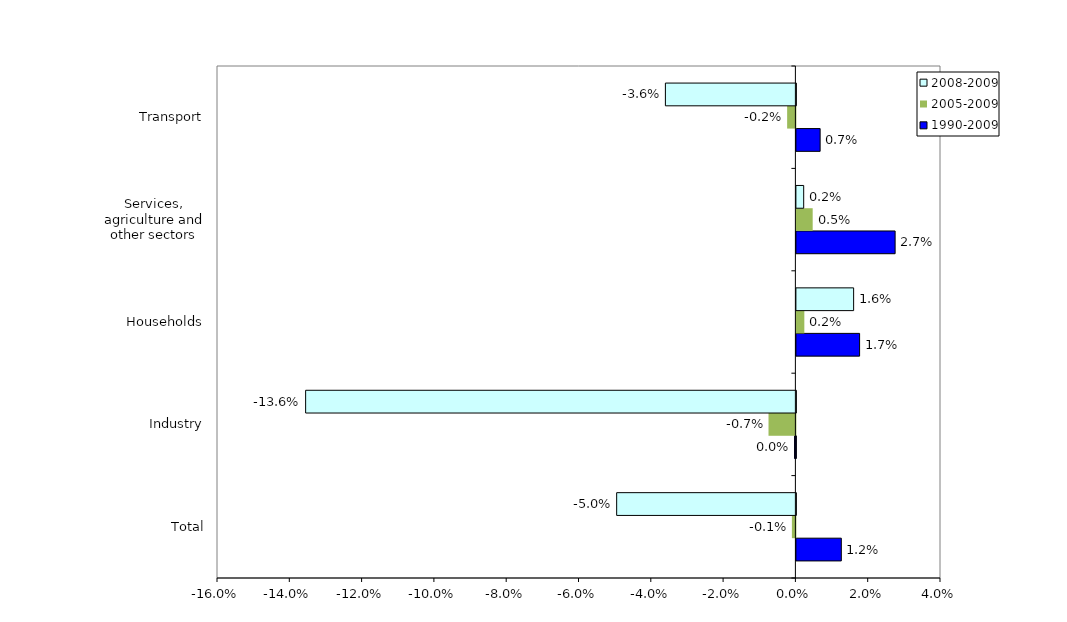
| Category | 1990-2009 | 2005-2009 | 2008-2009 |
|---|---|---|---|
| Total | 0.012 | -0.001 | -0.05 |
| Industry | 0 | -0.007 | -0.136 |
| Households | 0.017 | 0.002 | 0.016 |
| Services, agriculture and other sectors | 0.027 | 0.005 | 0.002 |
| Transport | 0.007 | -0.002 | -0.036 |